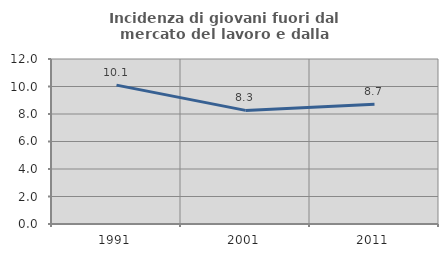
| Category | Incidenza di giovani fuori dal mercato del lavoro e dalla formazione  |
|---|---|
| 1991.0 | 10.099 |
| 2001.0 | 8.263 |
| 2011.0 | 8.702 |